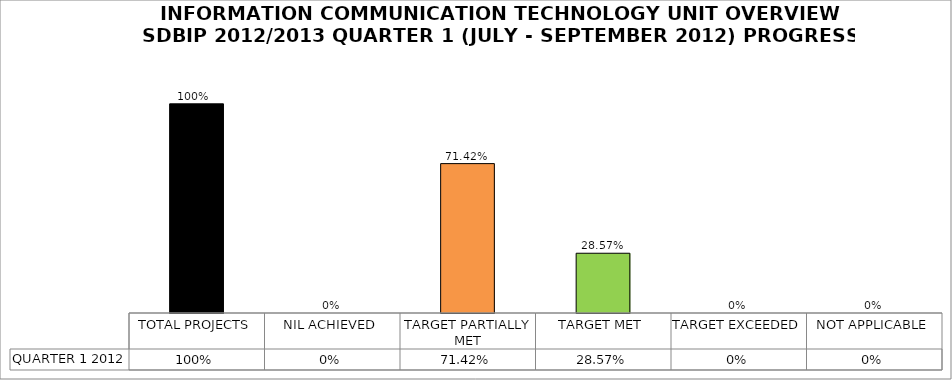
| Category | QUARTER 1 2012 |
|---|---|
| TOTAL PROJECTS | 1 |
| NIL ACHIEVED | 0 |
| TARGET PARTIALLY MET | 0.714 |
| TARGET MET | 0.286 |
| TARGET EXCEEDED | 0 |
| NOT APPLICABLE | 0 |